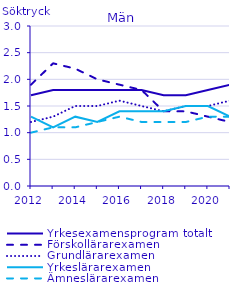
| Category | Yrkesexamensprogram totalt | Förskollärarexamen                                 | Grundlärarexamen                                   | Yrkeslärarexamen                                   | Ämneslärarexamen                                   |
|---|---|---|---|---|---|
| 2012.0 | 1.7 | 1.9 | 1.2 | 1.3 | 1 |
| 2013.0 | 1.8 | 2.3 | 1.3 | 1.1 | 1.1 |
| 2014.0 | 1.8 | 2.2 | 1.5 | 1.3 | 1.1 |
| 2015.0 | 1.8 | 2 | 1.5 | 1.2 | 1.2 |
| 2016.0 | 1.8 | 1.9 | 1.6 | 1.4 | 1.3 |
| 2017.0 | 1.8 | 1.8 | 1.5 | 1.4 | 1.2 |
| 2018.0 | 1.7 | 1.4 | 1.4 | 1.4 | 1.2 |
| 2019.0 | 1.7 | 1.4 | 1.5 | 1.5 | 1.2 |
| 2020.0 | 1.8 | 1.3 | 1.5 | 1.5 | 1.3 |
| 2021.0 | 1.9 | 1.2 | 1.6 | 1.3 | 1.3 |